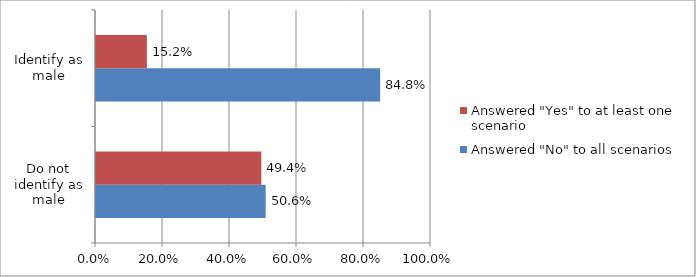
| Category | Answered "No" to all scenarios | Answered "Yes" to at least one scenario |
|---|---|---|
| Do not identify as male | 0.506 | 0.494 |
| Identify as male | 0.848 | 0.152 |